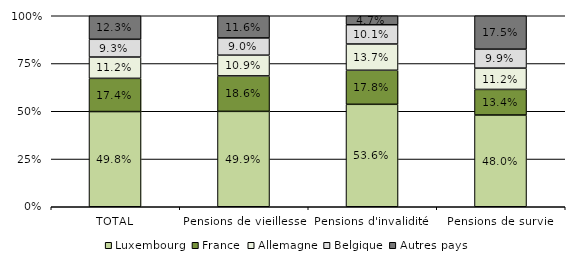
| Category | Luxembourg | France | Allemagne | Belgique | Autres pays |
|---|---|---|---|---|---|
| TOTAL | 0.498 | 0.174 | 0.112 | 0.093 | 0.123 |
| Pensions de vieillesse | 0.499 | 0.186 | 0.109 | 0.09 | 0.116 |
| Pensions d'invalidité  | 0.536 | 0.178 | 0.137 | 0.101 | 0.047 |
| Pensions de survie  | 0.48 | 0.134 | 0.112 | 0.099 | 0.175 |